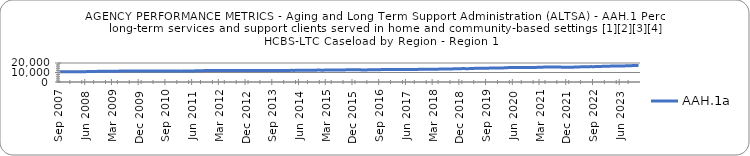
| Category | AAH.1a |
|---|---|
| 0.78378 | 10644 |
| 0.78567 | 10687 |
| 0.78719 | 10706 |
| 0.7887 | 10700 |
| 0.79022 | 10737 |
| 0.79129 | 10752 |
| 0.79193 | 10849 |
| 0.79455 | 10877 |
| 0.79439 | 10920 |
| 0.79457 | 10914 |
| 0.79632 | 10996 |
| 0.79721 | 11038 |
| 0.79865 | 11088 |
| 0.79917 | 11231 |
| 0.79965 | 11258 |
| 0.79991 | 11288 |
| 0.80036 | 11263 |
| 0.80119 | 11297 |
| 0.80135 | 11340 |
| 0.80196 | 11393 |
| 0.80282 | 11448 |
| 0.80375 | 11457 |
| 0.80441 | 11520 |
| 0.80454 | 11528 |
| 0.80574 | 11566 |
| 0.80717 | 11620 |
| 0.80907 | 11611 |
| 0.80996 | 11586 |
| 0.81048 | 11500 |
| 0.81132 | 11474 |
| 0.81235 | 11554 |
| 0.81422 | 11598 |
| 0.81521 | 11639 |
| 0.81511 | 11647 |
| 0.816 | 11676 |
| 0.81562 | 11688 |
| 0.8177 | 11687 |
| 0.81902 | 11695 |
| 0.81999 | 11590 |
| 0.8202 | 11541 |
| 0.82092 | 11506 |
| 0.82336 | 11434 |
| 0.82379 | 11537 |
| 0.82545 | 11571 |
| 0.82578 | 11613 |
| 0.82632 | 11619 |
| 0.82543 | 11798 |
| 0.82484 | 11924 |
| 0.82636 | 11906 |
| 0.82733 | 12040 |
| 0.82838 | 11988 |
| 0.82888 | 12131 |
| 0.82809 | 12017 |
| 0.82917 | 12007 |
| 0.82866 | 12076 |
| 0.82858 | 12113 |
| 0.82802 | 12123 |
| 0.82938 | 12110 |
| 0.83046 | 12081 |
| 0.83086 | 12161 |
| 0.83171 | 12099 |
| 0.83162 | 12156 |
| 0.83156 | 12110 |
| 0.8309 | 12060 |
| 0.83222 | 12118 |
| 0.83276 | 12049 |
| 0.83338 | 12073 |
| 0.83336 | 12078 |
| 0.83239 | 12108 |
| 0.83251 | 12093 |
| 0.8337 | 12160 |
| 0.83426 | 12199 |
| 0.83557 | 12134 |
| 0.83627 | 12209 |
| 0.83614 | 12206 |
| 0.83597 | 12197 |
| 0.83796 | 12206 |
| 0.83821 | 12160 |
| 0.83855 | 12258 |
| 0.84014 | 12221 |
| 0.83995 | 12276 |
| 0.84007 | 12292 |
| 0.8402 | 12310 |
| 0.841 | 12339 |
| 0.8424 | 12371 |
| 0.8431 | 12476 |
| 0.8435 | 12435 |
| 0.8439 | 12527 |
| 0.84383 | 12493 |
| 0.84463 | 12491 |
| 0.84443 | 12606 |
| 0.84487 | 12675 |
| 0.84543 | 12709 |
| 0.8466 | 12731 |
| 0.84682 | 12674 |
| 0.84816 | 12690 |
| 0.84589 | 12714 |
| 0.84646 | 12849 |
| 0.84772 | 12883 |
| 0.8486 | 12888 |
| 0.84786 | 12788 |
| 0.84849 | 12858 |
| 0.84851 | 12669 |
| 0.8492 | 12702 |
| 0.84852 | 12785 |
| 0.84989 | 12850 |
| 0.85076 | 12866 |
| 0.85196 | 12946 |
| 0.8534 | 13019 |
| 0.85355 | 13039 |
| 0.85326 | 13066 |
| 0.85294 | 13098 |
| 0.85119 | 13097 |
| 0.85152 | 13020 |
| 0.85143 | 13162 |
| 0.85182 | 13163 |
| 0.8521 | 13169 |
| 0.85264 | 13183 |
| 0.85441 | 13194 |
| 0.85526 | 13267 |
| 0.85728 | 13215 |
| 0.8577 | 13307 |
| 0.85845 | 13347 |
| 0.85828 | 13342 |
| 0.85799 | 13401 |
| 0.85772 | 13340 |
| 0.85887 | 13417 |
| 0.86116 | 13447 |
| 0.86123 | 13590 |
| 0.86193 | 13592 |
| 0.86372 | 13669 |
| 0.86147 | 13772 |
| 0.86303 | 13745 |
| 0.86431 | 13893 |
| 0.86533 | 13855 |
| 0.86473 | 13970 |
| 0.86411 | 14196 |
| 0.86504 | 13975 |
| 0.86518 | 14092 |
| 0.86641 | 14211 |
| 0.86717 | 14406 |
| 0.86792 | 14358 |
| 0.8694 | 14448 |
| 0.86921 | 14535 |
| 0.87375 | 14480 |
| 0.87927 | 14662 |
| 0.88196 | 14610 |
| 0.8826 | 14629 |
| 0.88378 | 14706 |
| 0.88511 | 14751 |
| 0.8857 | 14943 |
| 0.88923 | 15130 |
| 0.89424 | 15162 |
| 0.89466 | 15236 |
| 0.89512 | 15194 |
| 0.89475 | 15203 |
| 0.89525 | 15257 |
| 0.89485 | 15359 |
| 0.89346 | 15331 |
| 0.89386 | 15376 |
| 0.89048 | 15357 |
| 0.89013 | 15407 |
| 0.89185 | 15633 |
| 0.8934 | 15656 |
| 0.89298 | 15716 |
| 0.89372 | 15811 |
| 0.89661 | 15772 |
| 0.89824 | 15724 |
| 0.89708 | 15693 |
| 0.89662 | 15652 |
| 0.89759 | 15574 |
| 0.89814 | 15596 |
| 0.89823 | 15503 |
| 0.89819 | 15610 |
| 0.89789 | 15813 |
| 0.89829 | 15893 |
| 0.89874 | 15958 |
| 0.90061 | 16019 |
| 0.90125 | 16019 |
| 0.90115 | 16199 |
| 0.90196 | 16152 |
| 0.90133 | 16274 |
| 0.90135 | 16335 |
| 0.90118 | 16493 |
| 0.90219 | 16520 |
| 0.90296 | 16545 |
| 0.90356 | 16858 |
| 0.90607 | 16797 |
| 0.90755 | 16905 |
| 0.91023 | 16925 |
| nan | 16920 |
| nan | 17036 |
| nan | 17002 |
| nan | 17304 |
| nan | 17260 |
| nan | 17295 |